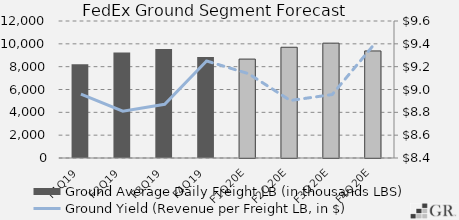
| Category | Ground Average Daily Freight LB (in thousands LBS) |
|---|---|
|  F1Q19  | 8221 |
|  F2Q19  | 9237 |
|  F3Q19  | 9550 |
|  F4Q19  | 8836 |
|  F1Q20E  | 8664.199 |
|  F2Q20E  | 9699.496 |
|  F3Q20E  | 10059.312 |
|  F4Q20E  | 9376.688 |